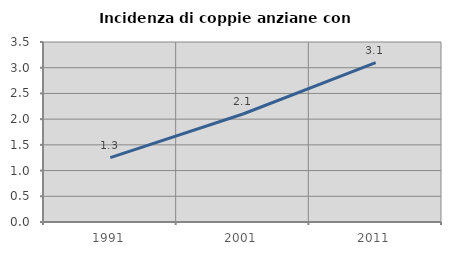
| Category | Incidenza di coppie anziane con figli |
|---|---|
| 1991.0 | 1.253 |
| 2001.0 | 2.1 |
| 2011.0 | 3.099 |